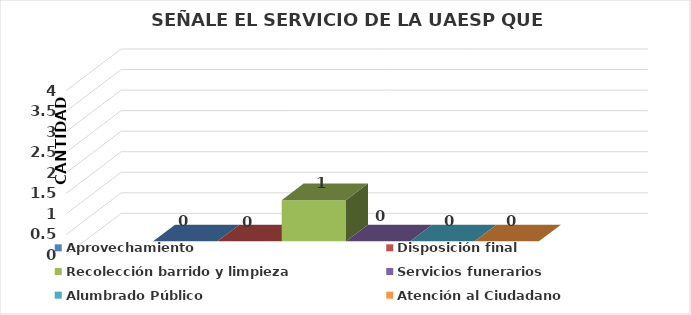
| Category | Aprovechamiento | Disposición final | Recolección barrido y limpieza | Servicios funerarios | Alumbrado Público | Atención al Ciudadano |
|---|---|---|---|---|---|---|
| 0 | 0 | 0 | 1 | 0 | 0 | 0 |